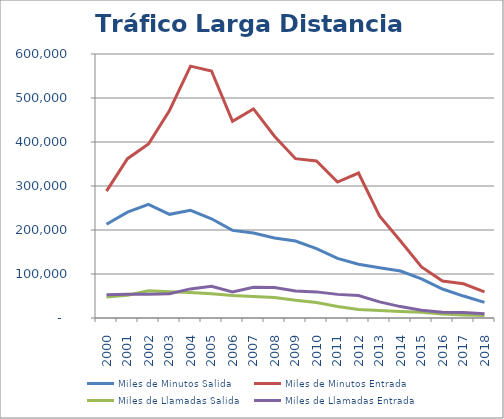
| Category | Miles de Minutos Salida  | Miles de Minutos Entrada | Miles de Llamadas Salida  | Miles de Llamadas Entrada |
|---|---|---|---|---|
| 2000 | 213111.889 | 288388.125 | 47935.313 | 52952.484 |
| 2001 | 240624.31 | 362105.965 | 51890.32 | 54050.474 |
| 2002 | 258263.207 | 395584.068 | 61696.706 | 53755.419 |
| 2003 | 235632.811 | 471710.26 | 59645.256 | 55151.805 |
| 2004 | 244879.421 | 572384.671 | 57875.109 | 66165.546 |
| 2005 | 225481.003 | 561441.7 | 55265.499 | 71975.899 |
| 2006 | 199057.012 | 447154.99 | 51113.174 | 58982.629 |
| 2007 | 193031.5 | 475329.384 | 48858.076 | 69933.935 |
| 2008 | 181903.703 | 413059.388 | 46744.176 | 69543.737 |
| 2009 | 174879.763 | 362075.623 | 40361.941 | 61194.621 |
| 2010 | 157654.648 | 357007.697 | 35316.058 | 59359.736 |
| 2011 | 135339.983 | 308905.292 | 26149.205 | 53691.514 |
| 2012 | 122043.466 | 329431.656 | 19101.011 | 50924.858 |
| 2013 | 114017.404 | 231797.265 | 17114.809 | 36575.406 |
| 2014 | 106668.68 | 175029.52 | 14990.781 | 25922.441 |
| 2015 | 89068.424 | 116143.021 | 12805.823 | 17673.903 |
| 2016 | 65918.92 | 84198.464 | 9191.072 | 13242.616 |
| 2017 | 49870.641 | 77843.799 | 7080.087 | 12633.004 |
| 2018 | 35557.963 | 59535.298 | 5474.876 | 9441.969 |